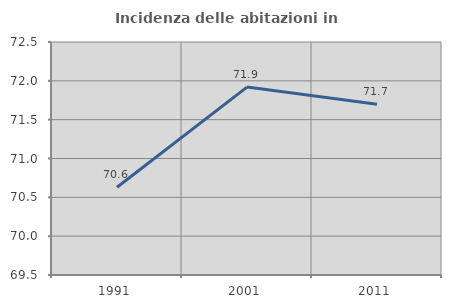
| Category | Incidenza delle abitazioni in proprietà  |
|---|---|
| 1991.0 | 70.63 |
| 2001.0 | 71.919 |
| 2011.0 | 71.699 |